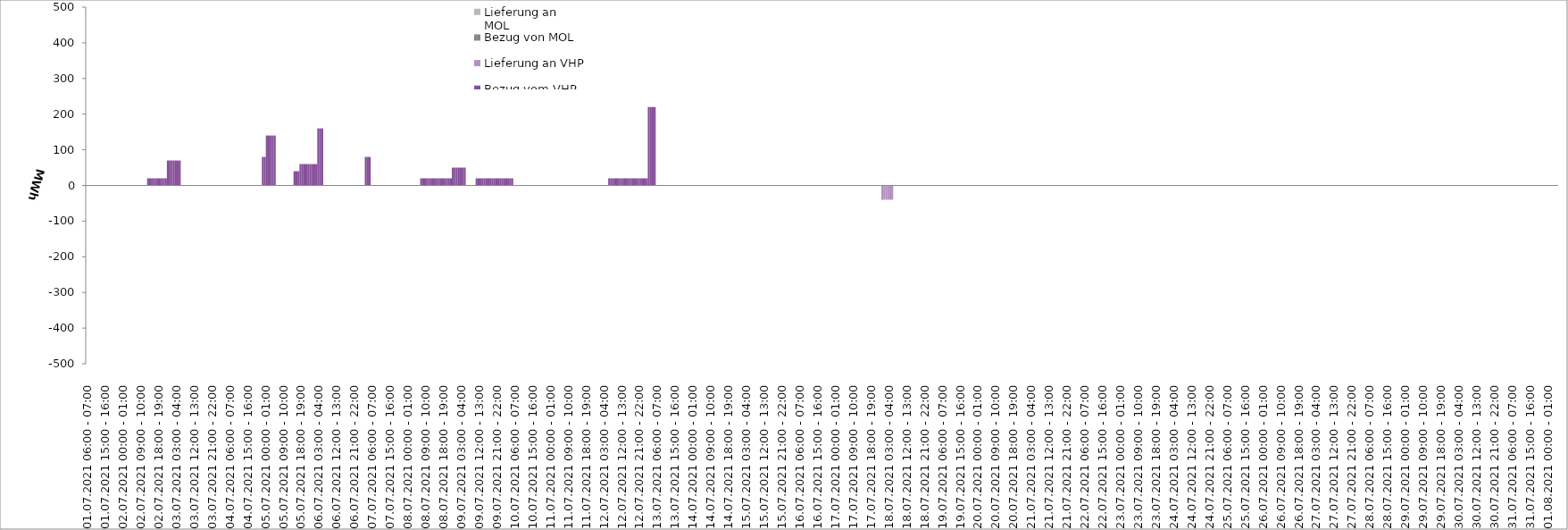
| Category | Bezug vom VHP | Lieferung an VHP | Bezug von MOL | Lieferung an MOL |
|---|---|---|---|---|
| 01.07.2021 06:00 - 07:00 | 0 | 0 | 0 | 0 |
| 01.07.2021 07:00 - 08:00 | 0 | 0 | 0 | 0 |
| 01.07.2021 08:00 - 09:00 | 0 | 0 | 0 | 0 |
| 01.07.2021 09:00 - 10:00 | 0 | 0 | 0 | 0 |
| 01.07.2021 10:00 - 11:00 | 0 | 0 | 0 | 0 |
| 01.07.2021 11:00 - 12:00 | 0 | 0 | 0 | 0 |
| 01.07.2021 12:00 - 13:00 | 0 | 0 | 0 | 0 |
| 01.07.2021 13:00 - 14:00 | 0 | 0 | 0 | 0 |
| 01.07.2021 14:00 - 15:00 | 0 | 0 | 0 | 0 |
| 01.07.2021 15:00 - 16:00 | 0 | 0 | 0 | 0 |
| 01.07.2021 16:00 - 17:00 | 0 | 0 | 0 | 0 |
| 01.07.2021 17:00 - 18:00 | 0 | 0 | 0 | 0 |
| 01.07.2021 18:00 - 19:00 | 0 | 0 | 0 | 0 |
| 01.07.2021 19:00 - 20:00 | 0 | 0 | 0 | 0 |
| 01.07.2021 20:00 - 21:00 | 0 | 0 | 0 | 0 |
| 01.07.2021 21:00 - 22:00 | 0 | 0 | 0 | 0 |
| 01.07.2021 22:00 - 23:00 | 0 | 0 | 0 | 0 |
| 01.07.2021 23:00 - 24:00 | 0 | 0 | 0 | 0 |
| 02.07.2021 00:00 - 01:00 | 0 | 0 | 0 | 0 |
| 02.07.2021 01:00 - 02:00 | 0 | 0 | 0 | 0 |
| 02.07.2021 02:00 - 03:00 | 0 | 0 | 0 | 0 |
| 02.07.2021 03:00 - 04:00 | 0 | 0 | 0 | 0 |
| 02.07.2021 04:00 - 05:00 | 0 | 0 | 0 | 0 |
| 02.07.2021 05:00 - 06:00 | 0 | 0 | 0 | 0 |
| 02.07.2021 06:00 - 07:00 | 0 | 0 | 0 | 0 |
| 02.07.2021 07:00 - 08:00 | 0 | 0 | 0 | 0 |
| 02.07.2021 08:00 - 09:00 | 0 | 0 | 0 | 0 |
| 02.07.2021 09:00 - 10:00 | 0 | 0 | 0 | 0 |
| 02.07.2021 10:00 - 11:00 | 0 | 0 | 0 | 0 |
| 02.07.2021 11:00 - 12:00 | 0 | 0 | 0 | 0 |
| 02.07.2021 12:00 - 13:00 | 0 | 0 | 0 | 0 |
| 02.07.2021 13:00 - 14:00 | 20 | 0 | 0 | 0 |
| 02.07.2021 14:00 - 15:00 | 20 | 0 | 0 | 0 |
| 02.07.2021 15:00 - 16:00 | 20 | 0 | 0 | 0 |
| 02.07.2021 16:00 - 17:00 | 20 | 0 | 0 | 0 |
| 02.07.2021 17:00 - 18:00 | 20 | 0 | 0 | 0 |
| 02.07.2021 18:00 - 19:00 | 20 | 0 | 0 | 0 |
| 02.07.2021 19:00 - 20:00 | 20 | 0 | 0 | 0 |
| 02.07.2021 20:00 - 21:00 | 20 | 0 | 0 | 0 |
| 02.07.2021 21:00 - 22:00 | 20 | 0 | 0 | 0 |
| 02.07.2021 22:00 - 23:00 | 20 | 0 | 0 | 0 |
| 02.07.2021 23:00 - 24:00 | 70 | 0 | 0 | 0 |
| 03.07.2021 00:00 - 01:00 | 70 | 0 | 0 | 0 |
| 03.07.2021 01:00 - 02:00 | 70 | 0 | 0 | 0 |
| 03.07.2021 02:00 - 03:00 | 70 | 0 | 0 | 0 |
| 03.07.2021 03:00 - 04:00 | 70 | 0 | 0 | 0 |
| 03.07.2021 04:00 - 05:00 | 70 | 0 | 0 | 0 |
| 03.07.2021 05:00 - 06:00 | 70 | 0 | 0 | 0 |
| 03.07.2021 06:00 - 07:00 | 0 | 0 | 0 | 0 |
| 03.07.2021 07:00 - 08:00 | 0 | 0 | 0 | 0 |
| 03.07.2021 08:00 - 09:00 | 0 | 0 | 0 | 0 |
| 03.07.2021 09:00 - 10:00 | 0 | 0 | 0 | 0 |
| 03.07.2021 10:00 - 11:00 | 0 | 0 | 0 | 0 |
| 03.07.2021 11:00 - 12:00 | 0 | 0 | 0 | 0 |
| 03.07.2021 12:00 - 13:00 | 0 | 0 | 0 | 0 |
| 03.07.2021 13:00 - 14:00 | 0 | 0 | 0 | 0 |
| 03.07.2021 14:00 - 15:00 | 0 | 0 | 0 | 0 |
| 03.07.2021 15:00 - 16:00 | 0 | 0 | 0 | 0 |
| 03.07.2021 16:00 - 17:00 | 0 | 0 | 0 | 0 |
| 03.07.2021 17:00 - 18:00 | 0 | 0 | 0 | 0 |
| 03.07.2021 18:00 - 19:00 | 0 | 0 | 0 | 0 |
| 03.07.2021 19:00 - 20:00 | 0 | 0 | 0 | 0 |
| 03.07.2021 20:00 - 21:00 | 0 | 0 | 0 | 0 |
| 03.07.2021 21:00 - 22:00 | 0 | 0 | 0 | 0 |
| 03.07.2021 22:00 - 23:00 | 0 | 0 | 0 | 0 |
| 03.07.2021 23:00 - 24:00 | 0 | 0 | 0 | 0 |
| 04.07.2021 00:00 - 01:00 | 0 | 0 | 0 | 0 |
| 04.07.2021 01:00 - 02:00 | 0 | 0 | 0 | 0 |
| 04.07.2021 02:00 - 03:00 | 0 | 0 | 0 | 0 |
| 04.07.2021 03:00 - 04:00 | 0 | 0 | 0 | 0 |
| 04.07.2021 04:00 - 05:00 | 0 | 0 | 0 | 0 |
| 04.07.2021 05:00 - 06:00 | 0 | 0 | 0 | 0 |
| 04.07.2021 06:00 - 07:00 | 0 | 0 | 0 | 0 |
| 04.07.2021 07:00 - 08:00 | 0 | 0 | 0 | 0 |
| 04.07.2021 08:00 - 09:00 | 0 | 0 | 0 | 0 |
| 04.07.2021 09:00 - 10:00 | 0 | 0 | 0 | 0 |
| 04.07.2021 10:00 - 11:00 | 0 | 0 | 0 | 0 |
| 04.07.2021 11:00 - 12:00 | 0 | 0 | 0 | 0 |
| 04.07.2021 12:00 - 13:00 | 0 | 0 | 0 | 0 |
| 04.07.2021 13:00 - 14:00 | 0 | 0 | 0 | 0 |
| 04.07.2021 14:00 - 15:00 | 0 | 0 | 0 | 0 |
| 04.07.2021 15:00 - 16:00 | 0 | 0 | 0 | 0 |
| 04.07.2021 16:00 - 17:00 | 0 | 0 | 0 | 0 |
| 04.07.2021 17:00 - 18:00 | 0 | 0 | 0 | 0 |
| 04.07.2021 18:00 - 19:00 | 0 | 0 | 0 | 0 |
| 04.07.2021 19:00 - 20:00 | 0 | 0 | 0 | 0 |
| 04.07.2021 20:00 - 21:00 | 0 | 0 | 0 | 0 |
| 04.07.2021 21:00 - 22:00 | 0 | 0 | 0 | 0 |
| 04.07.2021 22:00 - 23:00 | 0 | 0 | 0 | 0 |
| 04.07.2021 23:00 - 24:00 | 80 | 0 | 0 | 0 |
| 05.07.2021 00:00 - 01:00 | 80 | 0 | 0 | 0 |
| 05.07.2021 01:00 - 02:00 | 140 | 0 | 0 | 0 |
| 05.07.2021 02:00 - 03:00 | 140 | 0 | 0 | 0 |
| 05.07.2021 03:00 - 04:00 | 140 | 0 | 0 | 0 |
| 05.07.2021 04:00 - 05:00 | 140 | 0 | 0 | 0 |
| 05.07.2021 05:00 - 06:00 | 140 | 0 | 0 | 0 |
| 05.07.2021 06:00 - 07:00 | 0 | 0 | 0 | 0 |
| 05.07.2021 07:00 - 08:00 | 0 | 0 | 0 | 0 |
| 05.07.2021 08:00 - 09:00 | 0 | 0 | 0 | 0 |
| 05.07.2021 09:00 - 10:00 | 0 | 0 | 0 | 0 |
| 05.07.2021 10:00 - 11:00 | 0 | 0 | 0 | 0 |
| 05.07.2021 11:00 - 12:00 | 0 | 0 | 0 | 0 |
| 05.07.2021 12:00 - 13:00 | 0 | 0 | 0 | 0 |
| 05.07.2021 13:00 - 14:00 | 0 | 0 | 0 | 0 |
| 05.07.2021 14:00 - 15:00 | 0 | 0 | 0 | 0 |
| 05.07.2021 15:00 - 16:00 | 40 | 0 | 0 | 0 |
| 05.07.2021 16:00 - 17:00 | 40 | 0 | 0 | 0 |
| 05.07.2021 17:00 - 18:00 | 40 | 0 | 0 | 0 |
| 05.07.2021 18:00 - 19:00 | 60 | 0 | 0 | 0 |
| 05.07.2021 19:00 - 20:00 | 60 | 0 | 0 | 0 |
| 05.07.2021 20:00 - 21:00 | 60 | 0 | 0 | 0 |
| 05.07.2021 21:00 - 22:00 | 60 | 0 | 0 | 0 |
| 05.07.2021 22:00 - 23:00 | 60 | 0 | 0 | 0 |
| 05.07.2021 23:00 - 24:00 | 60 | 0 | 0 | 0 |
| 06.07.2021 00:00 - 01:00 | 60 | 0 | 0 | 0 |
| 06.07.2021 01:00 - 02:00 | 60 | 0 | 0 | 0 |
| 06.07.2021 02:00 - 03:00 | 60 | 0 | 0 | 0 |
| 06.07.2021 03:00 - 04:00 | 160 | 0 | 0 | 0 |
| 06.07.2021 04:00 - 05:00 | 160 | 0 | 0 | 0 |
| 06.07.2021 05:00 - 06:00 | 160 | 0 | 0 | 0 |
| 06.07.2021 06:00 - 07:00 | 0 | 0 | 0 | 0 |
| 06.07.2021 07:00 - 08:00 | 0 | 0 | 0 | 0 |
| 06.07.2021 08:00 - 09:00 | 0 | 0 | 0 | 0 |
| 06.07.2021 09:00 - 10:00 | 0 | 0 | 0 | 0 |
| 06.07.2021 10:00 - 11:00 | 0 | 0 | 0 | 0 |
| 06.07.2021 11:00 - 12:00 | 0 | 0 | 0 | 0 |
| 06.07.2021 12:00 - 13:00 | 0 | 0 | 0 | 0 |
| 06.07.2021 13:00 - 14:00 | 0 | 0 | 0 | 0 |
| 06.07.2021 14:00 - 15:00 | 0 | 0 | 0 | 0 |
| 06.07.2021 15:00 - 16:00 | 0 | 0 | 0 | 0 |
| 06.07.2021 16:00 - 17:00 | 0 | 0 | 0 | 0 |
| 06.07.2021 17:00 - 18:00 | 0 | 0 | 0 | 0 |
| 06.07.2021 18:00 - 19:00 | 0 | 0 | 0 | 0 |
| 06.07.2021 19:00 - 20:00 | 0 | 0 | 0 | 0 |
| 06.07.2021 20:00 - 21:00 | 0 | 0 | 0 | 0 |
| 06.07.2021 21:00 - 22:00 | 0 | 0 | 0 | 0 |
| 06.07.2021 22:00 - 23:00 | 0 | 0 | 0 | 0 |
| 06.07.2021 23:00 - 24:00 | 0 | 0 | 0 | 0 |
| 07.07.2021 00:00 - 01:00 | 0 | 0 | 0 | 0 |
| 07.07.2021 01:00 - 02:00 | 0 | 0 | 0 | 0 |
| 07.07.2021 02:00 - 03:00 | 0 | 0 | 0 | 0 |
| 07.07.2021 03:00 - 04:00 | 80 | 0 | 0 | 0 |
| 07.07.2021 04:00 - 05:00 | 80 | 0 | 0 | 0 |
| 07.07.2021 05:00 - 06:00 | 80 | 0 | 0 | 0 |
| 07.07.2021 06:00 - 07:00 | 0 | 0 | 0 | 0 |
| 07.07.2021 07:00 - 08:00 | 0 | 0 | 0 | 0 |
| 07.07.2021 08:00 - 09:00 | 0 | 0 | 0 | 0 |
| 07.07.2021 09:00 - 10:00 | 0 | 0 | 0 | 0 |
| 07.07.2021 10:00 - 11:00 | 0 | 0 | 0 | 0 |
| 07.07.2021 11:00 - 12:00 | 0 | 0 | 0 | 0 |
| 07.07.2021 12:00 - 13:00 | 0 | 0 | 0 | 0 |
| 07.07.2021 13:00 - 14:00 | 0 | 0 | 0 | 0 |
| 07.07.2021 14:00 - 15:00 | 0 | 0 | 0 | 0 |
| 07.07.2021 15:00 - 16:00 | 0 | 0 | 0 | 0 |
| 07.07.2021 16:00 - 17:00 | 0 | 0 | 0 | 0 |
| 07.07.2021 17:00 - 18:00 | 0 | 0 | 0 | 0 |
| 07.07.2021 18:00 - 19:00 | 0 | 0 | 0 | 0 |
| 07.07.2021 19:00 - 20:00 | 0 | 0 | 0 | 0 |
| 07.07.2021 20:00 - 21:00 | 0 | 0 | 0 | 0 |
| 07.07.2021 21:00 - 22:00 | 0 | 0 | 0 | 0 |
| 07.07.2021 22:00 - 23:00 | 0 | 0 | 0 | 0 |
| 07.07.2021 23:00 - 24:00 | 0 | 0 | 0 | 0 |
| 08.07.2021 00:00 - 01:00 | 0 | 0 | 0 | 0 |
| 08.07.2021 01:00 - 02:00 | 0 | 0 | 0 | 0 |
| 08.07.2021 02:00 - 03:00 | 0 | 0 | 0 | 0 |
| 08.07.2021 03:00 - 04:00 | 0 | 0 | 0 | 0 |
| 08.07.2021 04:00 - 05:00 | 0 | 0 | 0 | 0 |
| 08.07.2021 05:00 - 06:00 | 0 | 0 | 0 | 0 |
| 08.07.2021 06:00 - 07:00 | 0 | 0 | 0 | 0 |
| 08.07.2021 07:00 - 08:00 | 20 | 0 | 0 | 0 |
| 08.07.2021 08:00 - 09:00 | 20 | 0 | 0 | 0 |
| 08.07.2021 09:00 - 10:00 | 20 | 0 | 0 | 0 |
| 08.07.2021 10:00 - 11:00 | 20 | 0 | 0 | 0 |
| 08.07.2021 11:00 - 12:00 | 20 | 0 | 0 | 0 |
| 08.07.2021 12:00 - 13:00 | 20 | 0 | 0 | 0 |
| 08.07.2021 13:00 - 14:00 | 20 | 0 | 0 | 0 |
| 08.07.2021 14:00 - 15:00 | 20 | 0 | 0 | 0 |
| 08.07.2021 15:00 - 16:00 | 20 | 0 | 0 | 0 |
| 08.07.2021 16:00 - 17:00 | 20 | 0 | 0 | 0 |
| 08.07.2021 17:00 - 18:00 | 20 | 0 | 0 | 0 |
| 08.07.2021 18:00 - 19:00 | 20 | 0 | 0 | 0 |
| 08.07.2021 19:00 - 20:00 | 20 | 0 | 0 | 0 |
| 08.07.2021 20:00 - 21:00 | 20 | 0 | 0 | 0 |
| 08.07.2021 21:00 - 22:00 | 20 | 0 | 0 | 0 |
| 08.07.2021 22:00 - 23:00 | 20 | 0 | 0 | 0 |
| 08.07.2021 23:00 - 24:00 | 50 | 0 | 0 | 0 |
| 09.07.2021 00:00 - 01:00 | 50 | 0 | 0 | 0 |
| 09.07.2021 01:00 - 02:00 | 50 | 0 | 0 | 0 |
| 09.07.2021 02:00 - 03:00 | 50 | 0 | 0 | 0 |
| 09.07.2021 03:00 - 04:00 | 50 | 0 | 0 | 0 |
| 09.07.2021 04:00 - 05:00 | 50 | 0 | 0 | 0 |
| 09.07.2021 05:00 - 06:00 | 50 | 0 | 0 | 0 |
| 09.07.2021 06:00 - 07:00 | 0 | 0 | 0 | 0 |
| 09.07.2021 07:00 - 08:00 | 0 | 0 | 0 | 0 |
| 09.07.2021 08:00 - 09:00 | 0 | 0 | 0 | 0 |
| 09.07.2021 09:00 - 10:00 | 0 | 0 | 0 | 0 |
| 09.07.2021 10:00 - 11:00 | 0 | 0 | 0 | 0 |
| 09.07.2021 11:00 - 12:00 | 20 | 0 | 0 | 0 |
| 09.07.2021 12:00 - 13:00 | 20 | 0 | 0 | 0 |
| 09.07.2021 13:00 - 14:00 | 20 | 0 | 0 | 0 |
| 09.07.2021 14:00 - 15:00 | 20 | 0 | 0 | 0 |
| 09.07.2021 15:00 - 16:00 | 20 | 0 | 0 | 0 |
| 09.07.2021 16:00 - 17:00 | 20 | 0 | 0 | 0 |
| 09.07.2021 17:00 - 18:00 | 20 | 0 | 0 | 0 |
| 09.07.2021 18:00 - 19:00 | 20 | 0 | 0 | 0 |
| 09.07.2021 19:00 - 20:00 | 20 | 0 | 0 | 0 |
| 09.07.2021 20:00 - 21:00 | 20 | 0 | 0 | 0 |
| 09.07.2021 21:00 - 22:00 | 20 | 0 | 0 | 0 |
| 09.07.2021 22:00 - 23:00 | 20 | 0 | 0 | 0 |
| 09.07.2021 23:00 - 24:00 | 20 | 0 | 0 | 0 |
| 10.07.2021 00:00 - 01:00 | 20 | 0 | 0 | 0 |
| 10.07.2021 01:00 - 02:00 | 20 | 0 | 0 | 0 |
| 10.07.2021 02:00 - 03:00 | 20 | 0 | 0 | 0 |
| 10.07.2021 03:00 - 04:00 | 20 | 0 | 0 | 0 |
| 10.07.2021 04:00 - 05:00 | 20 | 0 | 0 | 0 |
| 10.07.2021 05:00 - 06:00 | 20 | 0 | 0 | 0 |
| 10.07.2021 06:00 - 07:00 | 0 | 0 | 0 | 0 |
| 10.07.2021 07:00 - 08:00 | 0 | 0 | 0 | 0 |
| 10.07.2021 08:00 - 09:00 | 0 | 0 | 0 | 0 |
| 10.07.2021 09:00 - 10:00 | 0 | 0 | 0 | 0 |
| 10.07.2021 10:00 - 11:00 | 0 | 0 | 0 | 0 |
| 10.07.2021 11:00 - 12:00 | 0 | 0 | 0 | 0 |
| 10.07.2021 12:00 - 13:00 | 0 | 0 | 0 | 0 |
| 10.07.2021 13:00 - 14:00 | 0 | 0 | 0 | 0 |
| 10.07.2021 14:00 - 15:00 | 0 | 0 | 0 | 0 |
| 10.07.2021 15:00 - 16:00 | 0 | 0 | 0 | 0 |
| 10.07.2021 16:00 - 17:00 | 0 | 0 | 0 | 0 |
| 10.07.2021 17:00 - 18:00 | 0 | 0 | 0 | 0 |
| 10.07.2021 18:00 - 19:00 | 0 | 0 | 0 | 0 |
| 10.07.2021 19:00 - 20:00 | 0 | 0 | 0 | 0 |
| 10.07.2021 20:00 - 21:00 | 0 | 0 | 0 | 0 |
| 10.07.2021 21:00 - 22:00 | 0 | 0 | 0 | 0 |
| 10.07.2021 22:00 - 23:00 | 0 | 0 | 0 | 0 |
| 10.07.2021 23:00 - 24:00 | 0 | 0 | 0 | 0 |
| 11.07.2021 00:00 - 01:00 | 0 | 0 | 0 | 0 |
| 11.07.2021 01:00 - 02:00 | 0 | 0 | 0 | 0 |
| 11.07.2021 02:00 - 03:00 | 0 | 0 | 0 | 0 |
| 11.07.2021 03:00 - 04:00 | 0 | 0 | 0 | 0 |
| 11.07.2021 04:00 - 05:00 | 0 | 0 | 0 | 0 |
| 11.07.2021 05:00 - 06:00 | 0 | 0 | 0 | 0 |
| 11.07.2021 06:00 - 07:00 | 0 | 0 | 0 | 0 |
| 11.07.2021 07:00 - 08:00 | 0 | 0 | 0 | 0 |
| 11.07.2021 08:00 - 09:00 | 0 | 0 | 0 | 0 |
| 11.07.2021 09:00 - 10:00 | 0 | 0 | 0 | 0 |
| 11.07.2021 10:00 - 11:00 | 0 | 0 | 0 | 0 |
| 11.07.2021 11:00 - 12:00 | 0 | 0 | 0 | 0 |
| 11.07.2021 12:00 - 13:00 | 0 | 0 | 0 | 0 |
| 11.07.2021 13:00 - 14:00 | 0 | 0 | 0 | 0 |
| 11.07.2021 14:00 - 15:00 | 0 | 0 | 0 | 0 |
| 11.07.2021 15:00 - 16:00 | 0 | 0 | 0 | 0 |
| 11.07.2021 16:00 - 17:00 | 0 | 0 | 0 | 0 |
| 11.07.2021 17:00 - 18:00 | 0 | 0 | 0 | 0 |
| 11.07.2021 18:00 - 19:00 | 0 | 0 | 0 | 0 |
| 11.07.2021 19:00 - 20:00 | 0 | 0 | 0 | 0 |
| 11.07.2021 20:00 - 21:00 | 0 | 0 | 0 | 0 |
| 11.07.2021 21:00 - 22:00 | 0 | 0 | 0 | 0 |
| 11.07.2021 22:00 - 23:00 | 0 | 0 | 0 | 0 |
| 11.07.2021 23:00 - 24:00 | 0 | 0 | 0 | 0 |
| 12.07.2021 00:00 - 01:00 | 0 | 0 | 0 | 0 |
| 12.07.2021 01:00 - 02:00 | 0 | 0 | 0 | 0 |
| 12.07.2021 02:00 - 03:00 | 0 | 0 | 0 | 0 |
| 12.07.2021 03:00 - 04:00 | 0 | 0 | 0 | 0 |
| 12.07.2021 04:00 - 05:00 | 0 | 0 | 0 | 0 |
| 12.07.2021 05:00 - 06:00 | 0 | 0 | 0 | 0 |
| 12.07.2021 06:00 - 07:00 | 20 | 0 | 0 | 0 |
| 12.07.2021 07:00 - 08:00 | 20 | 0 | 0 | 0 |
| 12.07.2021 08:00 - 09:00 | 20 | 0 | 0 | 0 |
| 12.07.2021 09:00 - 10:00 | 20 | 0 | 0 | 0 |
| 12.07.2021 10:00 - 11:00 | 20 | 0 | 0 | 0 |
| 12.07.2021 11:00 - 12:00 | 20 | 0 | 0 | 0 |
| 12.07.2021 12:00 - 13:00 | 20 | 0 | 0 | 0 |
| 12.07.2021 13:00 - 14:00 | 20 | 0 | 0 | 0 |
| 12.07.2021 14:00 - 15:00 | 20 | 0 | 0 | 0 |
| 12.07.2021 15:00 - 16:00 | 20 | 0 | 0 | 0 |
| 12.07.2021 16:00 - 17:00 | 20 | 0 | 0 | 0 |
| 12.07.2021 17:00 - 18:00 | 20 | 0 | 0 | 0 |
| 12.07.2021 18:00 - 19:00 | 20 | 0 | 0 | 0 |
| 12.07.2021 19:00 - 20:00 | 20 | 0 | 0 | 0 |
| 12.07.2021 20:00 - 21:00 | 20 | 0 | 0 | 0 |
| 12.07.2021 21:00 - 22:00 | 20 | 0 | 0 | 0 |
| 12.07.2021 22:00 - 23:00 | 20 | 0 | 0 | 0 |
| 12.07.2021 23:00 - 24:00 | 20 | 0 | 0 | 0 |
| 13.07.2021 00:00 - 01:00 | 20 | 0 | 0 | 0 |
| 13.07.2021 01:00 - 02:00 | 20 | 0 | 0 | 0 |
| 13.07.2021 02:00 - 03:00 | 220 | 0 | 0 | 0 |
| 13.07.2021 03:00 - 04:00 | 220 | 0 | 0 | 0 |
| 13.07.2021 04:00 - 05:00 | 220 | 0 | 0 | 0 |
| 13.07.2021 05:00 - 06:00 | 220 | 0 | 0 | 0 |
| 13.07.2021 06:00 - 07:00 | 0 | 0 | 0 | 0 |
| 13.07.2021 07:00 - 08:00 | 0 | 0 | 0 | 0 |
| 13.07.2021 08:00 - 09:00 | 0 | 0 | 0 | 0 |
| 13.07.2021 09:00 - 10:00 | 0 | 0 | 0 | 0 |
| 13.07.2021 10:00 - 11:00 | 0 | 0 | 0 | 0 |
| 13.07.2021 11:00 - 12:00 | 0 | 0 | 0 | 0 |
| 13.07.2021 12:00 - 13:00 | 0 | 0 | 0 | 0 |
| 13.07.2021 13:00 - 14:00 | 0 | 0 | 0 | 0 |
| 13.07.2021 14:00 - 15:00 | 0 | 0 | 0 | 0 |
| 13.07.2021 15:00 - 16:00 | 0 | 0 | 0 | 0 |
| 13.07.2021 16:00 - 17:00 | 0 | 0 | 0 | 0 |
| 13.07.2021 17:00 - 18:00 | 0 | 0 | 0 | 0 |
| 13.07.2021 18:00 - 19:00 | 0 | 0 | 0 | 0 |
| 13.07.2021 19:00 - 20:00 | 0 | 0 | 0 | 0 |
| 13.07.2021 20:00 - 21:00 | 0 | 0 | 0 | 0 |
| 13.07.2021 21:00 - 22:00 | 0 | 0 | 0 | 0 |
| 13.07.2021 22:00 - 23:00 | 0 | 0 | 0 | 0 |
| 13.07.2021 23:00 - 24:00 | 0 | 0 | 0 | 0 |
| 14.07.2021 00:00 - 01:00 | 0 | 0 | 0 | 0 |
| 14.07.2021 01:00 - 02:00 | 0 | 0 | 0 | 0 |
| 14.07.2021 02:00 - 03:00 | 0 | 0 | 0 | 0 |
| 14.07.2021 03:00 - 04:00 | 0 | 0 | 0 | 0 |
| 14.07.2021 04:00 - 05:00 | 0 | 0 | 0 | 0 |
| 14.07.2021 05:00 - 06:00 | 0 | 0 | 0 | 0 |
| 14.07.2021 06:00 - 07:00 | 0 | 0 | 0 | 0 |
| 14.07.2021 07:00 - 08:00 | 0 | 0 | 0 | 0 |
| 14.07.2021 08:00 - 09:00 | 0 | 0 | 0 | 0 |
| 14.07.2021 09:00 - 10:00 | 0 | 0 | 0 | 0 |
| 14.07.2021 10:00 - 11:00 | 0 | 0 | 0 | 0 |
| 14.07.2021 11:00 - 12:00 | 0 | 0 | 0 | 0 |
| 14.07.2021 12:00 - 13:00 | 0 | 0 | 0 | 0 |
| 14.07.2021 13:00 - 14:00 | 0 | 0 | 0 | 0 |
| 14.07.2021 14:00 - 15:00 | 0 | 0 | 0 | 0 |
| 14.07.2021 15:00 - 16:00 | 0 | 0 | 0 | 0 |
| 14.07.2021 16:00 - 17:00 | 0 | 0 | 0 | 0 |
| 14.07.2021 17:00 - 18:00 | 0 | 0 | 0 | 0 |
| 14.07.2021 18:00 - 19:00 | 0 | 0 | 0 | 0 |
| 14.07.2021 19:00 - 20:00 | 0 | 0 | 0 | 0 |
| 14.07.2021 20:00 - 21:00 | 0 | 0 | 0 | 0 |
| 14.07.2021 21:00 - 22:00 | 0 | 0 | 0 | 0 |
| 14.07.2021 22:00 - 23:00 | 0 | 0 | 0 | 0 |
| 14.07.2021 23:00 - 24:00 | 0 | 0 | 0 | 0 |
| 15.07.2021 00:00 - 01:00 | 0 | 0 | 0 | 0 |
| 15.07.2021 01:00 - 02:00 | 0 | 0 | 0 | 0 |
| 15.07.2021 02:00 - 03:00 | 0 | 0 | 0 | 0 |
| 15.07.2021 03:00 - 04:00 | 0 | 0 | 0 | 0 |
| 15.07.2021 04:00 - 05:00 | 0 | 0 | 0 | 0 |
| 15.07.2021 05:00 - 06:00 | 0 | 0 | 0 | 0 |
| 15.07.2021 06:00 - 07:00 | 0 | 0 | 0 | 0 |
| 15.07.2021 07:00 - 08:00 | 0 | 0 | 0 | 0 |
| 15.07.2021 08:00 - 09:00 | 0 | 0 | 0 | 0 |
| 15.07.2021 09:00 - 10:00 | 0 | 0 | 0 | 0 |
| 15.07.2021 10:00 - 11:00 | 0 | 0 | 0 | 0 |
| 15.07.2021 11:00 - 12:00 | 0 | 0 | 0 | 0 |
| 15.07.2021 12:00 - 13:00 | 0 | 0 | 0 | 0 |
| 15.07.2021 13:00 - 14:00 | 0 | 0 | 0 | 0 |
| 15.07.2021 14:00 - 15:00 | 0 | 0 | 0 | 0 |
| 15.07.2021 15:00 - 16:00 | 0 | 0 | 0 | 0 |
| 15.07.2021 16:00 - 17:00 | 0 | 0 | 0 | 0 |
| 15.07.2021 17:00 - 18:00 | 0 | 0 | 0 | 0 |
| 15.07.2021 18:00 - 19:00 | 0 | 0 | 0 | 0 |
| 15.07.2021 19:00 - 20:00 | 0 | 0 | 0 | 0 |
| 15.07.2021 20:00 - 21:00 | 0 | 0 | 0 | 0 |
| 15.07.2021 21:00 - 22:00 | 0 | 0 | 0 | 0 |
| 15.07.2021 22:00 - 23:00 | 0 | 0 | 0 | 0 |
| 15.07.2021 23:00 - 24:00 | 0 | 0 | 0 | 0 |
| 16.07.2021 00:00 - 01:00 | 0 | 0 | 0 | 0 |
| 16.07.2021 01:00 - 02:00 | 0 | 0 | 0 | 0 |
| 16.07.2021 02:00 - 03:00 | 0 | 0 | 0 | 0 |
| 16.07.2021 03:00 - 04:00 | 0 | 0 | 0 | 0 |
| 16.07.2021 04:00 - 05:00 | 0 | 0 | 0 | 0 |
| 16.07.2021 05:00 - 06:00 | 0 | 0 | 0 | 0 |
| 16.07.2021 06:00 - 07:00 | 0 | 0 | 0 | 0 |
| 16.07.2021 07:00 - 08:00 | 0 | 0 | 0 | 0 |
| 16.07.2021 08:00 - 09:00 | 0 | 0 | 0 | 0 |
| 16.07.2021 09:00 - 10:00 | 0 | 0 | 0 | 0 |
| 16.07.2021 10:00 - 11:00 | 0 | 0 | 0 | 0 |
| 16.07.2021 11:00 - 12:00 | 0 | 0 | 0 | 0 |
| 16.07.2021 12:00 - 13:00 | 0 | 0 | 0 | 0 |
| 16.07.2021 13:00 - 14:00 | 0 | 0 | 0 | 0 |
| 16.07.2021 14:00 - 15:00 | 0 | 0 | 0 | 0 |
| 16.07.2021 15:00 - 16:00 | 0 | 0 | 0 | 0 |
| 16.07.2021 16:00 - 17:00 | 0 | 0 | 0 | 0 |
| 16.07.2021 17:00 - 18:00 | 0 | 0 | 0 | 0 |
| 16.07.2021 18:00 - 19:00 | 0 | 0 | 0 | 0 |
| 16.07.2021 19:00 - 20:00 | 0 | 0 | 0 | 0 |
| 16.07.2021 20:00 - 21:00 | 0 | 0 | 0 | 0 |
| 16.07.2021 21:00 - 22:00 | 0 | 0 | 0 | 0 |
| 16.07.2021 22:00 - 23:00 | 0 | 0 | 0 | 0 |
| 16.07.2021 23:00 - 24:00 | 0 | 0 | 0 | 0 |
| 17.07.2021 00:00 - 01:00 | 0 | 0 | 0 | 0 |
| 17.07.2021 01:00 - 02:00 | 0 | 0 | 0 | 0 |
| 17.07.2021 02:00 - 03:00 | 0 | 0 | 0 | 0 |
| 17.07.2021 03:00 - 04:00 | 0 | 0 | 0 | 0 |
| 17.07.2021 04:00 - 05:00 | 0 | 0 | 0 | 0 |
| 17.07.2021 05:00 - 06:00 | 0 | 0 | 0 | 0 |
| 17.07.2021 06:00 - 07:00 | 0 | 0 | 0 | 0 |
| 17.07.2021 07:00 - 08:00 | 0 | 0 | 0 | 0 |
| 17.07.2021 08:00 - 09:00 | 0 | 0 | 0 | 0 |
| 17.07.2021 09:00 - 10:00 | 0 | 0 | 0 | 0 |
| 17.07.2021 10:00 - 11:00 | 0 | 0 | 0 | 0 |
| 17.07.2021 11:00 - 12:00 | 0 | 0 | 0 | 0 |
| 17.07.2021 12:00 - 13:00 | 0 | 0 | 0 | 0 |
| 17.07.2021 13:00 - 14:00 | 0 | 0 | 0 | 0 |
| 17.07.2021 14:00 - 15:00 | 0 | 0 | 0 | 0 |
| 17.07.2021 15:00 - 16:00 | 0 | 0 | 0 | 0 |
| 17.07.2021 16:00 - 17:00 | 0 | 0 | 0 | 0 |
| 17.07.2021 17:00 - 18:00 | 0 | 0 | 0 | 0 |
| 17.07.2021 18:00 - 19:00 | 0 | 0 | 0 | 0 |
| 17.07.2021 19:00 - 20:00 | 0 | 0 | 0 | 0 |
| 17.07.2021 20:00 - 21:00 | 0 | 0 | 0 | 0 |
| 17.07.2021 21:00 - 22:00 | 0 | 0 | 0 | 0 |
| 17.07.2021 22:00 - 23:00 | 0 | 0 | 0 | 0 |
| 17.07.2021 23:00 - 24:00 | 0 | 0 | 0 | 0 |
| 18.07.2021 00:00 - 01:00 | 0 | -40 | 0 | 0 |
| 18.07.2021 01:00 - 02:00 | 0 | -40 | 0 | 0 |
| 18.07.2021 02:00 - 03:00 | 0 | -40 | 0 | 0 |
| 18.07.2021 03:00 - 04:00 | 0 | -40 | 0 | 0 |
| 18.07.2021 04:00 - 05:00 | 0 | -40 | 0 | 0 |
| 18.07.2021 05:00 - 06:00 | 0 | -40 | 0 | 0 |
| 18.07.2021 06:00 - 07:00 | 0 | 0 | 0 | 0 |
| 18.07.2021 07:00 - 08:00 | 0 | 0 | 0 | 0 |
| 18.07.2021 08:00 - 09:00 | 0 | 0 | 0 | 0 |
| 18.07.2021 09:00 - 10:00 | 0 | 0 | 0 | 0 |
| 18.07.2021 10:00 - 11:00 | 0 | 0 | 0 | 0 |
| 18.07.2021 11:00 - 12:00 | 0 | 0 | 0 | 0 |
| 18.07.2021 12:00 - 13:00 | 0 | 0 | 0 | 0 |
| 18.07.2021 13:00 - 14:00 | 0 | 0 | 0 | 0 |
| 18.07.2021 14:00 - 15:00 | 0 | 0 | 0 | 0 |
| 18.07.2021 15:00 - 16:00 | 0 | 0 | 0 | 0 |
| 18.07.2021 16:00 - 17:00 | 0 | 0 | 0 | 0 |
| 18.07.2021 17:00 - 18:00 | 0 | 0 | 0 | 0 |
| 18.07.2021 18:00 - 19:00 | 0 | 0 | 0 | 0 |
| 18.07.2021 19:00 - 20:00 | 0 | 0 | 0 | 0 |
| 18.07.2021 20:00 - 21:00 | 0 | 0 | 0 | 0 |
| 18.07.2021 21:00 - 22:00 | 0 | 0 | 0 | 0 |
| 18.07.2021 22:00 - 23:00 | 0 | 0 | 0 | 0 |
| 18.07.2021 23:00 - 24:00 | 0 | 0 | 0 | 0 |
| 19.07.2021 00:00 - 01:00 | 0 | 0 | 0 | 0 |
| 19.07.2021 01:00 - 02:00 | 0 | 0 | 0 | 0 |
| 19.07.2021 02:00 - 03:00 | 0 | 0 | 0 | 0 |
| 19.07.2021 03:00 - 04:00 | 0 | 0 | 0 | 0 |
| 19.07.2021 04:00 - 05:00 | 0 | 0 | 0 | 0 |
| 19.07.2021 05:00 - 06:00 | 0 | 0 | 0 | 0 |
| 19.07.2021 06:00 - 07:00 | 0 | 0 | 0 | 0 |
| 19.07.2021 07:00 - 08:00 | 0 | 0 | 0 | 0 |
| 19.07.2021 08:00 - 09:00 | 0 | 0 | 0 | 0 |
| 19.07.2021 09:00 - 10:00 | 0 | 0 | 0 | 0 |
| 19.07.2021 10:00 - 11:00 | 0 | 0 | 0 | 0 |
| 19.07.2021 11:00 - 12:00 | 0 | 0 | 0 | 0 |
| 19.07.2021 12:00 - 13:00 | 0 | 0 | 0 | 0 |
| 19.07.2021 13:00 - 14:00 | 0 | 0 | 0 | 0 |
| 19.07.2021 14:00 - 15:00 | 0 | 0 | 0 | 0 |
| 19.07.2021 15:00 - 16:00 | 0 | 0 | 0 | 0 |
| 19.07.2021 16:00 - 17:00 | 0 | 0 | 0 | 0 |
| 19.07.2021 17:00 - 18:00 | 0 | 0 | 0 | 0 |
| 19.07.2021 18:00 - 19:00 | 0 | 0 | 0 | 0 |
| 19.07.2021 19:00 - 20:00 | 0 | 0 | 0 | 0 |
| 19.07.2021 20:00 - 21:00 | 0 | 0 | 0 | 0 |
| 19.07.2021 21:00 - 22:00 | 0 | 0 | 0 | 0 |
| 19.07.2021 22:00 - 23:00 | 0 | 0 | 0 | 0 |
| 19.07.2021 23:00 - 24:00 | 0 | 0 | 0 | 0 |
| 20.07.2021 00:00 - 01:00 | 0 | 0 | 0 | 0 |
| 20.07.2021 01:00 - 02:00 | 0 | 0 | 0 | 0 |
| 20.07.2021 02:00 - 03:00 | 0 | 0 | 0 | 0 |
| 20.07.2021 03:00 - 04:00 | 0 | 0 | 0 | 0 |
| 20.07.2021 04:00 - 05:00 | 0 | 0 | 0 | 0 |
| 20.07.2021 05:00 - 06:00 | 0 | 0 | 0 | 0 |
| 20.07.2021 06:00 - 07:00 | 0 | 0 | 0 | 0 |
| 20.07.2021 07:00 - 08:00 | 0 | 0 | 0 | 0 |
| 20.07.2021 08:00 - 09:00 | 0 | 0 | 0 | 0 |
| 20.07.2021 09:00 - 10:00 | 0 | 0 | 0 | 0 |
| 20.07.2021 10:00 - 11:00 | 0 | 0 | 0 | 0 |
| 20.07.2021 11:00 - 12:00 | 0 | 0 | 0 | 0 |
| 20.07.2021 12:00 - 13:00 | 0 | 0 | 0 | 0 |
| 20.07.2021 13:00 - 14:00 | 0 | 0 | 0 | 0 |
| 20.07.2021 14:00 - 15:00 | 0 | 0 | 0 | 0 |
| 20.07.2021 15:00 - 16:00 | 0 | 0 | 0 | 0 |
| 20.07.2021 16:00 - 17:00 | 0 | 0 | 0 | 0 |
| 20.07.2021 17:00 - 18:00 | 0 | 0 | 0 | 0 |
| 20.07.2021 18:00 - 19:00 | 0 | 0 | 0 | 0 |
| 20.07.2021 19:00 - 20:00 | 0 | 0 | 0 | 0 |
| 20.07.2021 20:00 - 21:00 | 0 | 0 | 0 | 0 |
| 20.07.2021 21:00 - 22:00 | 0 | 0 | 0 | 0 |
| 20.07.2021 22:00 - 23:00 | 0 | 0 | 0 | 0 |
| 20.07.2021 23:00 - 24:00 | 0 | 0 | 0 | 0 |
| 21.07.2021 00:00 - 01:00 | 0 | 0 | 0 | 0 |
| 21.07.2021 01:00 - 02:00 | 0 | 0 | 0 | 0 |
| 21.07.2021 02:00 - 03:00 | 0 | 0 | 0 | 0 |
| 21.07.2021 03:00 - 04:00 | 0 | 0 | 0 | 0 |
| 21.07.2021 04:00 - 05:00 | 0 | 0 | 0 | 0 |
| 21.07.2021 05:00 - 06:00 | 0 | 0 | 0 | 0 |
| 21.07.2021 06:00 - 07:00 | 0 | 0 | 0 | 0 |
| 21.07.2021 07:00 - 08:00 | 0 | 0 | 0 | 0 |
| 21.07.2021 08:00 - 09:00 | 0 | 0 | 0 | 0 |
| 21.07.2021 09:00 - 10:00 | 0 | 0 | 0 | 0 |
| 21.07.2021 10:00 - 11:00 | 0 | 0 | 0 | 0 |
| 21.07.2021 11:00 - 12:00 | 0 | 0 | 0 | 0 |
| 21.07.2021 12:00 - 13:00 | 0 | 0 | 0 | 0 |
| 21.07.2021 13:00 - 14:00 | 0 | 0 | 0 | 0 |
| 21.07.2021 14:00 - 15:00 | 0 | 0 | 0 | 0 |
| 21.07.2021 15:00 - 16:00 | 0 | 0 | 0 | 0 |
| 21.07.2021 16:00 - 17:00 | 0 | 0 | 0 | 0 |
| 21.07.2021 17:00 - 18:00 | 0 | 0 | 0 | 0 |
| 21.07.2021 18:00 - 19:00 | 0 | 0 | 0 | 0 |
| 21.07.2021 19:00 - 20:00 | 0 | 0 | 0 | 0 |
| 21.07.2021 20:00 - 21:00 | 0 | 0 | 0 | 0 |
| 21.07.2021 21:00 - 22:00 | 0 | 0 | 0 | 0 |
| 21.07.2021 22:00 - 23:00 | 0 | 0 | 0 | 0 |
| 21.07.2021 23:00 - 24:00 | 0 | 0 | 0 | 0 |
| 22.07.2021 00:00 - 01:00 | 0 | 0 | 0 | 0 |
| 22.07.2021 01:00 - 02:00 | 0 | 0 | 0 | 0 |
| 22.07.2021 02:00 - 03:00 | 0 | 0 | 0 | 0 |
| 22.07.2021 03:00 - 04:00 | 0 | 0 | 0 | 0 |
| 22.07.2021 04:00 - 05:00 | 0 | 0 | 0 | 0 |
| 22.07.2021 05:00 - 06:00 | 0 | 0 | 0 | 0 |
| 22.07.2021 06:00 - 07:00 | 0 | 0 | 0 | 0 |
| 22.07.2021 07:00 - 08:00 | 0 | 0 | 0 | 0 |
| 22.07.2021 08:00 - 09:00 | 0 | 0 | 0 | 0 |
| 22.07.2021 09:00 - 10:00 | 0 | 0 | 0 | 0 |
| 22.07.2021 10:00 - 11:00 | 0 | 0 | 0 | 0 |
| 22.07.2021 11:00 - 12:00 | 0 | 0 | 0 | 0 |
| 22.07.2021 12:00 - 13:00 | 0 | 0 | 0 | 0 |
| 22.07.2021 13:00 - 14:00 | 0 | 0 | 0 | 0 |
| 22.07.2021 14:00 - 15:00 | 0 | 0 | 0 | 0 |
| 22.07.2021 15:00 - 16:00 | 0 | 0 | 0 | 0 |
| 22.07.2021 16:00 - 17:00 | 0 | 0 | 0 | 0 |
| 22.07.2021 17:00 - 18:00 | 0 | 0 | 0 | 0 |
| 22.07.2021 18:00 - 19:00 | 0 | 0 | 0 | 0 |
| 22.07.2021 19:00 - 20:00 | 0 | 0 | 0 | 0 |
| 22.07.2021 20:00 - 21:00 | 0 | 0 | 0 | 0 |
| 22.07.2021 21:00 - 22:00 | 0 | 0 | 0 | 0 |
| 22.07.2021 22:00 - 23:00 | 0 | 0 | 0 | 0 |
| 22.07.2021 23:00 - 24:00 | 0 | 0 | 0 | 0 |
| 23.07.2021 00:00 - 01:00 | 0 | 0 | 0 | 0 |
| 23.07.2021 01:00 - 02:00 | 0 | 0 | 0 | 0 |
| 23.07.2021 02:00 - 03:00 | 0 | 0 | 0 | 0 |
| 23.07.2021 03:00 - 04:00 | 0 | 0 | 0 | 0 |
| 23.07.2021 04:00 - 05:00 | 0 | 0 | 0 | 0 |
| 23.07.2021 05:00 - 06:00 | 0 | 0 | 0 | 0 |
| 23.07.2021 06:00 - 07:00 | 0 | 0 | 0 | 0 |
| 23.07.2021 07:00 - 08:00 | 0 | 0 | 0 | 0 |
| 23.07.2021 08:00 - 09:00 | 0 | 0 | 0 | 0 |
| 23.07.2021 09:00 - 10:00 | 0 | 0 | 0 | 0 |
| 23.07.2021 10:00 - 11:00 | 0 | 0 | 0 | 0 |
| 23.07.2021 11:00 - 12:00 | 0 | 0 | 0 | 0 |
| 23.07.2021 12:00 - 13:00 | 0 | 0 | 0 | 0 |
| 23.07.2021 13:00 - 14:00 | 0 | 0 | 0 | 0 |
| 23.07.2021 14:00 - 15:00 | 0 | 0 | 0 | 0 |
| 23.07.2021 15:00 - 16:00 | 0 | 0 | 0 | 0 |
| 23.07.2021 16:00 - 17:00 | 0 | 0 | 0 | 0 |
| 23.07.2021 17:00 - 18:00 | 0 | 0 | 0 | 0 |
| 23.07.2021 18:00 - 19:00 | 0 | 0 | 0 | 0 |
| 23.07.2021 19:00 - 20:00 | 0 | 0 | 0 | 0 |
| 23.07.2021 20:00 - 21:00 | 0 | 0 | 0 | 0 |
| 23.07.2021 21:00 - 22:00 | 0 | 0 | 0 | 0 |
| 23.07.2021 22:00 - 23:00 | 0 | 0 | 0 | 0 |
| 23.07.2021 23:00 - 24:00 | 0 | 0 | 0 | 0 |
| 24.07.2021 00:00 - 01:00 | 0 | 0 | 0 | 0 |
| 24.07.2021 01:00 - 02:00 | 0 | 0 | 0 | 0 |
| 24.07.2021 02:00 - 03:00 | 0 | 0 | 0 | 0 |
| 24.07.2021 03:00 - 04:00 | 0 | 0 | 0 | 0 |
| 24.07.2021 04:00 - 05:00 | 0 | 0 | 0 | 0 |
| 24.07.2021 05:00 - 06:00 | 0 | 0 | 0 | 0 |
| 24.07.2021 06:00 - 07:00 | 0 | 0 | 0 | 0 |
| 24.07.2021 07:00 - 08:00 | 0 | 0 | 0 | 0 |
| 24.07.2021 08:00 - 09:00 | 0 | 0 | 0 | 0 |
| 24.07.2021 09:00 - 10:00 | 0 | 0 | 0 | 0 |
| 24.07.2021 10:00 - 11:00 | 0 | 0 | 0 | 0 |
| 24.07.2021 11:00 - 12:00 | 0 | 0 | 0 | 0 |
| 24.07.2021 12:00 - 13:00 | 0 | 0 | 0 | 0 |
| 24.07.2021 13:00 - 14:00 | 0 | 0 | 0 | 0 |
| 24.07.2021 14:00 - 15:00 | 0 | 0 | 0 | 0 |
| 24.07.2021 15:00 - 16:00 | 0 | 0 | 0 | 0 |
| 24.07.2021 16:00 - 17:00 | 0 | 0 | 0 | 0 |
| 24.07.2021 17:00 - 18:00 | 0 | 0 | 0 | 0 |
| 24.07.2021 18:00 - 19:00 | 0 | 0 | 0 | 0 |
| 24.07.2021 19:00 - 20:00 | 0 | 0 | 0 | 0 |
| 24.07.2021 20:00 - 21:00 | 0 | 0 | 0 | 0 |
| 24.07.2021 21:00 - 22:00 | 0 | 0 | 0 | 0 |
| 24.07.2021 22:00 - 23:00 | 0 | 0 | 0 | 0 |
| 24.07.2021 23:00 - 24:00 | 0 | 0 | 0 | 0 |
| 25.07.2021 00:00 - 01:00 | 0 | 0 | 0 | 0 |
| 25.07.2021 01:00 - 02:00 | 0 | 0 | 0 | 0 |
| 25.07.2021 02:00 - 03:00 | 0 | 0 | 0 | 0 |
| 25.07.2021 03:00 - 04:00 | 0 | 0 | 0 | 0 |
| 25.07.2021 04:00 - 05:00 | 0 | 0 | 0 | 0 |
| 25.07.2021 05:00 - 06:00 | 0 | 0 | 0 | 0 |
| 25.07.2021 06:00 - 07:00 | 0 | 0 | 0 | 0 |
| 25.07.2021 07:00 - 08:00 | 0 | 0 | 0 | 0 |
| 25.07.2021 08:00 - 09:00 | 0 | 0 | 0 | 0 |
| 25.07.2021 09:00 - 10:00 | 0 | 0 | 0 | 0 |
| 25.07.2021 10:00 - 11:00 | 0 | 0 | 0 | 0 |
| 25.07.2021 11:00 - 12:00 | 0 | 0 | 0 | 0 |
| 25.07.2021 12:00 - 13:00 | 0 | 0 | 0 | 0 |
| 25.07.2021 13:00 - 14:00 | 0 | 0 | 0 | 0 |
| 25.07.2021 14:00 - 15:00 | 0 | 0 | 0 | 0 |
| 25.07.2021 15:00 - 16:00 | 0 | 0 | 0 | 0 |
| 25.07.2021 16:00 - 17:00 | 0 | 0 | 0 | 0 |
| 25.07.2021 17:00 - 18:00 | 0 | 0 | 0 | 0 |
| 25.07.2021 18:00 - 19:00 | 0 | 0 | 0 | 0 |
| 25.07.2021 19:00 - 20:00 | 0 | 0 | 0 | 0 |
| 25.07.2021 20:00 - 21:00 | 0 | 0 | 0 | 0 |
| 25.07.2021 21:00 - 22:00 | 0 | 0 | 0 | 0 |
| 25.07.2021 22:00 - 23:00 | 0 | 0 | 0 | 0 |
| 25.07.2021 23:00 - 24:00 | 0 | 0 | 0 | 0 |
| 26.07.2021 00:00 - 01:00 | 0 | 0 | 0 | 0 |
| 26.07.2021 01:00 - 02:00 | 0 | 0 | 0 | 0 |
| 26.07.2021 02:00 - 03:00 | 0 | 0 | 0 | 0 |
| 26.07.2021 03:00 - 04:00 | 0 | 0 | 0 | 0 |
| 26.07.2021 04:00 - 05:00 | 0 | 0 | 0 | 0 |
| 26.07.2021 05:00 - 06:00 | 0 | 0 | 0 | 0 |
| 26.07.2021 06:00 - 07:00 | 0 | 0 | 0 | 0 |
| 26.07.2021 07:00 - 08:00 | 0 | 0 | 0 | 0 |
| 26.07.2021 08:00 - 09:00 | 0 | 0 | 0 | 0 |
| 26.07.2021 09:00 - 10:00 | 0 | 0 | 0 | 0 |
| 26.07.2021 10:00 - 11:00 | 0 | 0 | 0 | 0 |
| 26.07.2021 11:00 - 12:00 | 0 | 0 | 0 | 0 |
| 26.07.2021 12:00 - 13:00 | 0 | 0 | 0 | 0 |
| 26.07.2021 13:00 - 14:00 | 0 | 0 | 0 | 0 |
| 26.07.2021 14:00 - 15:00 | 0 | 0 | 0 | 0 |
| 26.07.2021 15:00 - 16:00 | 0 | 0 | 0 | 0 |
| 26.07.2021 16:00 - 17:00 | 0 | 0 | 0 | 0 |
| 26.07.2021 17:00 - 18:00 | 0 | 0 | 0 | 0 |
| 26.07.2021 18:00 - 19:00 | 0 | 0 | 0 | 0 |
| 26.07.2021 19:00 - 20:00 | 0 | 0 | 0 | 0 |
| 26.07.2021 20:00 - 21:00 | 0 | 0 | 0 | 0 |
| 26.07.2021 21:00 - 22:00 | 0 | 0 | 0 | 0 |
| 26.07.2021 22:00 - 23:00 | 0 | 0 | 0 | 0 |
| 26.07.2021 23:00 - 24:00 | 0 | 0 | 0 | 0 |
| 27.07.2021 00:00 - 01:00 | 0 | 0 | 0 | 0 |
| 27.07.2021 01:00 - 02:00 | 0 | 0 | 0 | 0 |
| 27.07.2021 02:00 - 03:00 | 0 | 0 | 0 | 0 |
| 27.07.2021 03:00 - 04:00 | 0 | 0 | 0 | 0 |
| 27.07.2021 04:00 - 05:00 | 0 | 0 | 0 | 0 |
| 27.07.2021 05:00 - 06:00 | 0 | 0 | 0 | 0 |
| 27.07.2021 06:00 - 07:00 | 0 | 0 | 0 | 0 |
| 27.07.2021 07:00 - 08:00 | 0 | 0 | 0 | 0 |
| 27.07.2021 08:00 - 09:00 | 0 | 0 | 0 | 0 |
| 27.07.2021 09:00 - 10:00 | 0 | 0 | 0 | 0 |
| 27.07.2021 10:00 - 11:00 | 0 | 0 | 0 | 0 |
| 27.07.2021 11:00 - 12:00 | 0 | 0 | 0 | 0 |
| 27.07.2021 12:00 - 13:00 | 0 | 0 | 0 | 0 |
| 27.07.2021 13:00 - 14:00 | 0 | 0 | 0 | 0 |
| 27.07.2021 14:00 - 15:00 | 0 | 0 | 0 | 0 |
| 27.07.2021 15:00 - 16:00 | 0 | 0 | 0 | 0 |
| 27.07.2021 16:00 - 17:00 | 0 | 0 | 0 | 0 |
| 27.07.2021 17:00 - 18:00 | 0 | 0 | 0 | 0 |
| 27.07.2021 18:00 - 19:00 | 0 | 0 | 0 | 0 |
| 27.07.2021 19:00 - 20:00 | 0 | 0 | 0 | 0 |
| 27.07.2021 20:00 - 21:00 | 0 | 0 | 0 | 0 |
| 27.07.2021 21:00 - 22:00 | 0 | 0 | 0 | 0 |
| 27.07.2021 22:00 - 23:00 | 0 | 0 | 0 | 0 |
| 27.07.2021 23:00 - 24:00 | 0 | 0 | 0 | 0 |
| 28.07.2021 00:00 - 01:00 | 0 | 0 | 0 | 0 |
| 28.07.2021 01:00 - 02:00 | 0 | 0 | 0 | 0 |
| 28.07.2021 02:00 - 03:00 | 0 | 0 | 0 | 0 |
| 28.07.2021 03:00 - 04:00 | 0 | 0 | 0 | 0 |
| 28.07.2021 04:00 - 05:00 | 0 | 0 | 0 | 0 |
| 28.07.2021 05:00 - 06:00 | 0 | 0 | 0 | 0 |
| 28.07.2021 06:00 - 07:00 | 0 | 0 | 0 | 0 |
| 28.07.2021 07:00 - 08:00 | 0 | 0 | 0 | 0 |
| 28.07.2021 08:00 - 09:00 | 0 | 0 | 0 | 0 |
| 28.07.2021 09:00 - 10:00 | 0 | 0 | 0 | 0 |
| 28.07.2021 10:00 - 11:00 | 0 | 0 | 0 | 0 |
| 28.07.2021 11:00 - 12:00 | 0 | 0 | 0 | 0 |
| 28.07.2021 12:00 - 13:00 | 0 | 0 | 0 | 0 |
| 28.07.2021 13:00 - 14:00 | 0 | 0 | 0 | 0 |
| 28.07.2021 14:00 - 15:00 | 0 | 0 | 0 | 0 |
| 28.07.2021 15:00 - 16:00 | 0 | 0 | 0 | 0 |
| 28.07.2021 16:00 - 17:00 | 0 | 0 | 0 | 0 |
| 28.07.2021 17:00 - 18:00 | 0 | 0 | 0 | 0 |
| 28.07.2021 18:00 - 19:00 | 0 | 0 | 0 | 0 |
| 28.07.2021 19:00 - 20:00 | 0 | 0 | 0 | 0 |
| 28.07.2021 20:00 - 21:00 | 0 | 0 | 0 | 0 |
| 28.07.2021 21:00 - 22:00 | 0 | 0 | 0 | 0 |
| 28.07.2021 22:00 - 23:00 | 0 | 0 | 0 | 0 |
| 28.07.2021 23:00 - 24:00 | 0 | 0 | 0 | 0 |
| 29.07.2021 00:00 - 01:00 | 0 | 0 | 0 | 0 |
| 29.07.2021 01:00 - 02:00 | 0 | 0 | 0 | 0 |
| 29.07.2021 02:00 - 03:00 | 0 | 0 | 0 | 0 |
| 29.07.2021 03:00 - 04:00 | 0 | 0 | 0 | 0 |
| 29.07.2021 04:00 - 05:00 | 0 | 0 | 0 | 0 |
| 29.07.2021 05:00 - 06:00 | 0 | 0 | 0 | 0 |
| 29.07.2021 06:00 - 07:00 | 0 | 0 | 0 | 0 |
| 29.07.2021 07:00 - 08:00 | 0 | 0 | 0 | 0 |
| 29.07.2021 08:00 - 09:00 | 0 | 0 | 0 | 0 |
| 29.07.2021 09:00 - 10:00 | 0 | 0 | 0 | 0 |
| 29.07.2021 10:00 - 11:00 | 0 | 0 | 0 | 0 |
| 29.07.2021 11:00 - 12:00 | 0 | 0 | 0 | 0 |
| 29.07.2021 12:00 - 13:00 | 0 | 0 | 0 | 0 |
| 29.07.2021 13:00 - 14:00 | 0 | 0 | 0 | 0 |
| 29.07.2021 14:00 - 15:00 | 0 | 0 | 0 | 0 |
| 29.07.2021 15:00 - 16:00 | 0 | 0 | 0 | 0 |
| 29.07.2021 16:00 - 17:00 | 0 | 0 | 0 | 0 |
| 29.07.2021 17:00 - 18:00 | 0 | 0 | 0 | 0 |
| 29.07.2021 18:00 - 19:00 | 0 | 0 | 0 | 0 |
| 29.07.2021 19:00 - 20:00 | 0 | 0 | 0 | 0 |
| 29.07.2021 20:00 - 21:00 | 0 | 0 | 0 | 0 |
| 29.07.2021 21:00 - 22:00 | 0 | 0 | 0 | 0 |
| 29.07.2021 22:00 - 23:00 | 0 | 0 | 0 | 0 |
| 29.07.2021 23:00 - 24:00 | 0 | 0 | 0 | 0 |
| 30.07.2021 00:00 - 01:00 | 0 | 0 | 0 | 0 |
| 30.07.2021 01:00 - 02:00 | 0 | 0 | 0 | 0 |
| 30.07.2021 02:00 - 03:00 | 0 | 0 | 0 | 0 |
| 30.07.2021 03:00 - 04:00 | 0 | 0 | 0 | 0 |
| 30.07.2021 04:00 - 05:00 | 0 | 0 | 0 | 0 |
| 30.07.2021 05:00 - 06:00 | 0 | 0 | 0 | 0 |
| 30.07.2021 06:00 - 07:00 | 0 | 0 | 0 | 0 |
| 30.07.2021 07:00 - 08:00 | 0 | 0 | 0 | 0 |
| 30.07.2021 08:00 - 09:00 | 0 | 0 | 0 | 0 |
| 30.07.2021 09:00 - 10:00 | 0 | 0 | 0 | 0 |
| 30.07.2021 10:00 - 11:00 | 0 | 0 | 0 | 0 |
| 30.07.2021 11:00 - 12:00 | 0 | 0 | 0 | 0 |
| 30.07.2021 12:00 - 13:00 | 0 | 0 | 0 | 0 |
| 30.07.2021 13:00 - 14:00 | 0 | 0 | 0 | 0 |
| 30.07.2021 14:00 - 15:00 | 0 | 0 | 0 | 0 |
| 30.07.2021 15:00 - 16:00 | 0 | 0 | 0 | 0 |
| 30.07.2021 16:00 - 17:00 | 0 | 0 | 0 | 0 |
| 30.07.2021 17:00 - 18:00 | 0 | 0 | 0 | 0 |
| 30.07.2021 18:00 - 19:00 | 0 | 0 | 0 | 0 |
| 30.07.2021 19:00 - 20:00 | 0 | 0 | 0 | 0 |
| 30.07.2021 20:00 - 21:00 | 0 | 0 | 0 | 0 |
| 30.07.2021 21:00 - 22:00 | 0 | 0 | 0 | 0 |
| 30.07.2021 22:00 - 23:00 | 0 | 0 | 0 | 0 |
| 30.07.2021 23:00 - 24:00 | 0 | 0 | 0 | 0 |
| 31.07.2021 00:00 - 01:00 | 0 | 0 | 0 | 0 |
| 31.07.2021 01:00 - 02:00 | 0 | 0 | 0 | 0 |
| 31.07.2021 02:00 - 03:00 | 0 | 0 | 0 | 0 |
| 31.07.2021 03:00 - 04:00 | 0 | 0 | 0 | 0 |
| 31.07.2021 04:00 - 05:00 | 0 | 0 | 0 | 0 |
| 31.07.2021 05:00 - 06:00 | 0 | 0 | 0 | 0 |
| 31.07.2021 06:00 - 07:00 | 0 | 0 | 0 | 0 |
| 31.07.2021 07:00 - 08:00 | 0 | 0 | 0 | 0 |
| 31.07.2021 08:00 - 09:00 | 0 | 0 | 0 | 0 |
| 31.07.2021 09:00 - 10:00 | 0 | 0 | 0 | 0 |
| 31.07.2021 10:00 - 11:00 | 0 | 0 | 0 | 0 |
| 31.07.2021 11:00 - 12:00 | 0 | 0 | 0 | 0 |
| 31.07.2021 12:00 - 13:00 | 0 | 0 | 0 | 0 |
| 31.07.2021 13:00 - 14:00 | 0 | 0 | 0 | 0 |
| 31.07.2021 14:00 - 15:00 | 0 | 0 | 0 | 0 |
| 31.07.2021 15:00 - 16:00 | 0 | 0 | 0 | 0 |
| 31.07.2021 16:00 - 17:00 | 0 | 0 | 0 | 0 |
| 31.07.2021 17:00 - 18:00 | 0 | 0 | 0 | 0 |
| 31.07.2021 18:00 - 19:00 | 0 | 0 | 0 | 0 |
| 31.07.2021 19:00 - 20:00 | 0 | 0 | 0 | 0 |
| 31.07.2021 20:00 - 21:00 | 0 | 0 | 0 | 0 |
| 31.07.2021 21:00 - 22:00 | 0 | 0 | 0 | 0 |
| 31.07.2021 22:00 - 23:00 | 0 | 0 | 0 | 0 |
| 31.07.2021 23:00 - 24:00 | 0 | 0 | 0 | 0 |
| 01.08.2021 00:00 - 01:00 | 0 | 0 | 0 | 0 |
| 01.08.2021 01:00 - 02:00 | 0 | 0 | 0 | 0 |
| 01.08.2021 02:00 - 03:00 | 0 | 0 | 0 | 0 |
| 01.08.2021 03:00 - 04:00 | 0 | 0 | 0 | 0 |
| 01.08.2021 04:00 - 05:00 | 0 | 0 | 0 | 0 |
| 01.08.2021 05:00 - 06:00 | 0 | 0 | 0 | 0 |